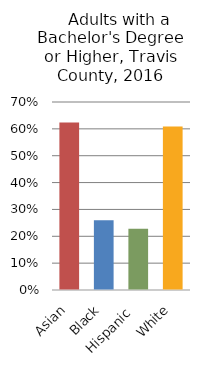
| Category |     Bachelor's degree or higher |
|---|---|
| Asian | 0.624 |
| Black | 0.26 |
| Hispanic  | 0.228 |
| White | 0.609 |